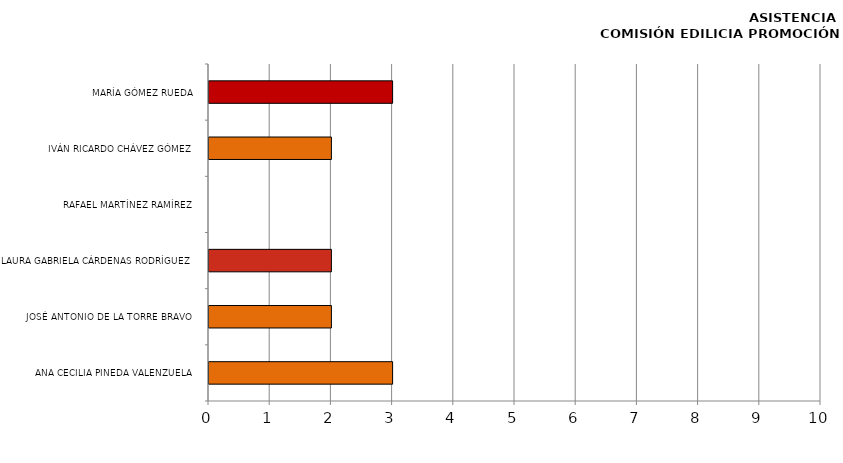
| Category | Series 0 |
|---|---|
| ANA CECILIA PINEDA VALENZUELA | 3 |
| JOSÉ ANTONIO DE LA TORRE BRAVO | 2 |
| LAURA GABRIELA CÁRDENAS RODRÍGUEZ | 2 |
| RAFAEL MARTÍNEZ RAMÍREZ | 0 |
| IVÁN RICARDO CHÁVEZ GÓMEZ | 2 |
| MARÍA GÓMEZ RUEDA | 3 |